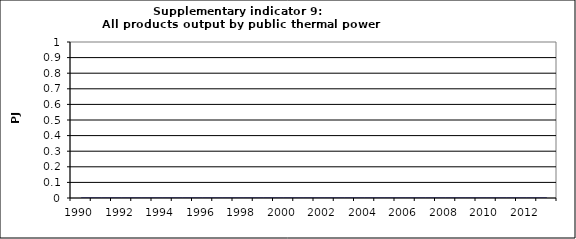
| Category | All products output by public thermal power stations, PJ |
|---|---|
| 1990 | 0 |
| 1991 | 0 |
| 1992 | 0 |
| 1993 | 0 |
| 1994 | 0 |
| 1995 | 0 |
| 1996 | 0 |
| 1997 | 0 |
| 1998 | 0 |
| 1999 | 0 |
| 2000 | 0 |
| 2001 | 0 |
| 2002 | 0 |
| 2003 | 0 |
| 2004 | 0 |
| 2005 | 0 |
| 2006 | 0 |
| 2007 | 0 |
| 2008 | 0 |
| 2009 | 0 |
| 2010 | 0 |
| 2011 | 0 |
| 2012 | 0 |
| 2013 | 0 |